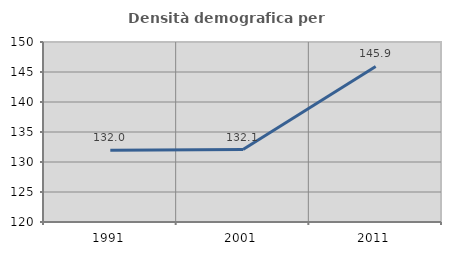
| Category | Densità demografica |
|---|---|
| 1991.0 | 131.957 |
| 2001.0 | 132.074 |
| 2011.0 | 145.934 |